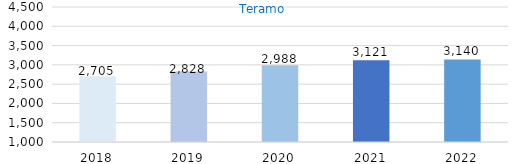
| Category | Series 0 |
|---|---|
| 2018.0 | 2705 |
| 2019.0 | 2828 |
| 2020.0 | 2988 |
| 2021.0 | 3121 |
| 2022.0 | 3140 |